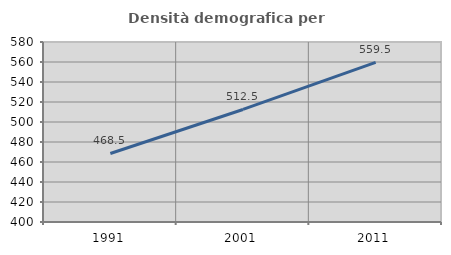
| Category | Densità demografica |
|---|---|
| 1991.0 | 468.507 |
| 2001.0 | 512.545 |
| 2011.0 | 559.544 |